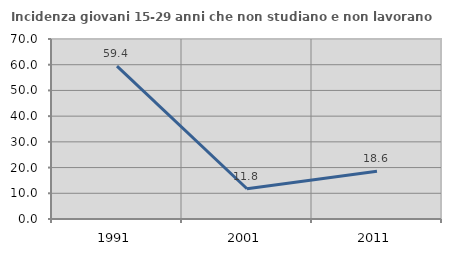
| Category | Incidenza giovani 15-29 anni che non studiano e non lavorano  |
|---|---|
| 1991.0 | 59.434 |
| 2001.0 | 11.765 |
| 2011.0 | 18.576 |